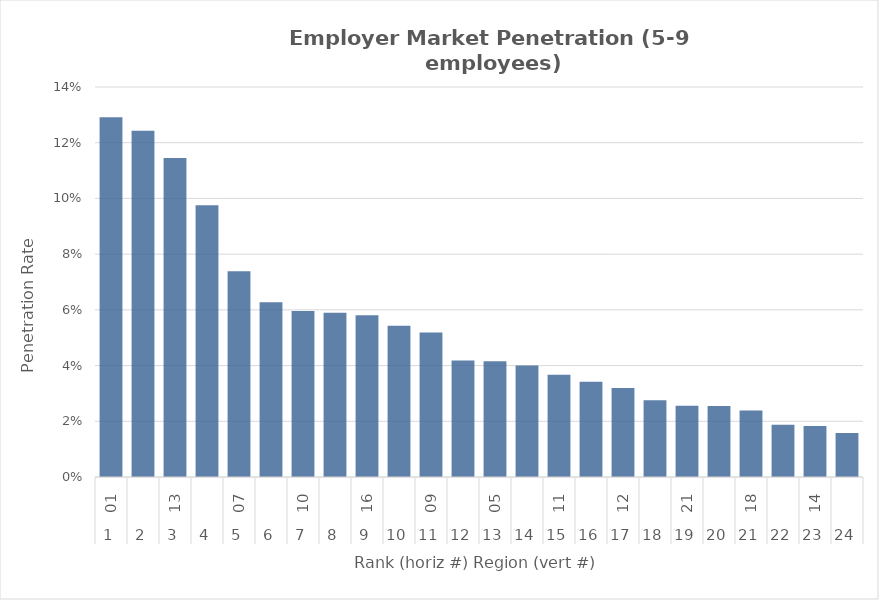
| Category | Rate |
|---|---|
| 0 | 0.129 |
| 1 | 0.124 |
| 2 | 0.114 |
| 3 | 0.098 |
| 4 | 0.074 |
| 5 | 0.063 |
| 6 | 0.06 |
| 7 | 0.059 |
| 8 | 0.058 |
| 9 | 0.054 |
| 10 | 0.052 |
| 11 | 0.042 |
| 12 | 0.042 |
| 13 | 0.04 |
| 14 | 0.037 |
| 15 | 0.034 |
| 16 | 0.032 |
| 17 | 0.028 |
| 18 | 0.026 |
| 19 | 0.025 |
| 20 | 0.024 |
| 21 | 0.019 |
| 22 | 0.018 |
| 23 | 0.016 |